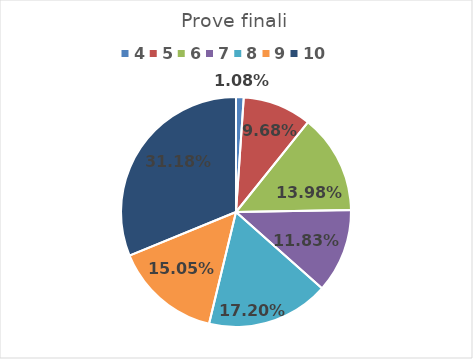
| Category | Series 0 |
|---|---|
| 4.0 | 0.011 |
| 5.0 | 0.097 |
| 6.0 | 0.14 |
| 7.0 | 0.118 |
| 8.0 | 0.172 |
| 9.0 | 0.151 |
| 10.0 | 0.312 |